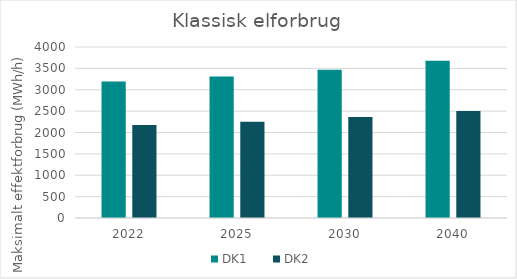
| Category | DK1 | DK2 |
|---|---|---|
| 2022.0 | 3192.881 | 2176.636 |
| 2025.0 | 3308.085 | 2253.808 |
| 2030.0 | 3466.116 | 2359.673 |
| 2040.0 | 3679.621 | 2501.854 |